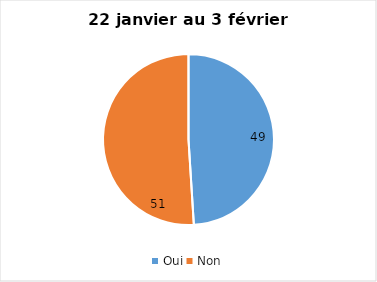
| Category | Series 0 |
|---|---|
| Oui | 49 |
| Non | 51 |